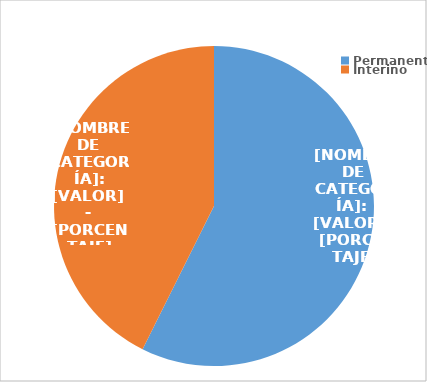
| Category | Series 0 |
|---|---|
| Permanente | 3236 |
| Interino | 2405 |